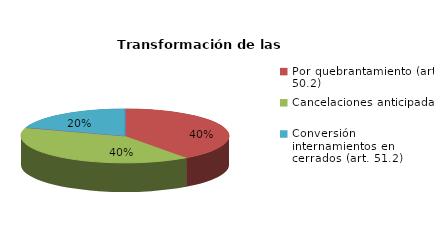
| Category | Series 0 |
|---|---|
| Reducciones y sustituciones (arts. 13 y 51) | 0 |
| Por quebrantamiento (art. 50.2) | 2 |
| Cancelaciones anticipadas | 2 |
| Traslado a Centros Penitenciarios | 0 |
| Conversión internamientos en cerrados (art. 51.2) | 1 |